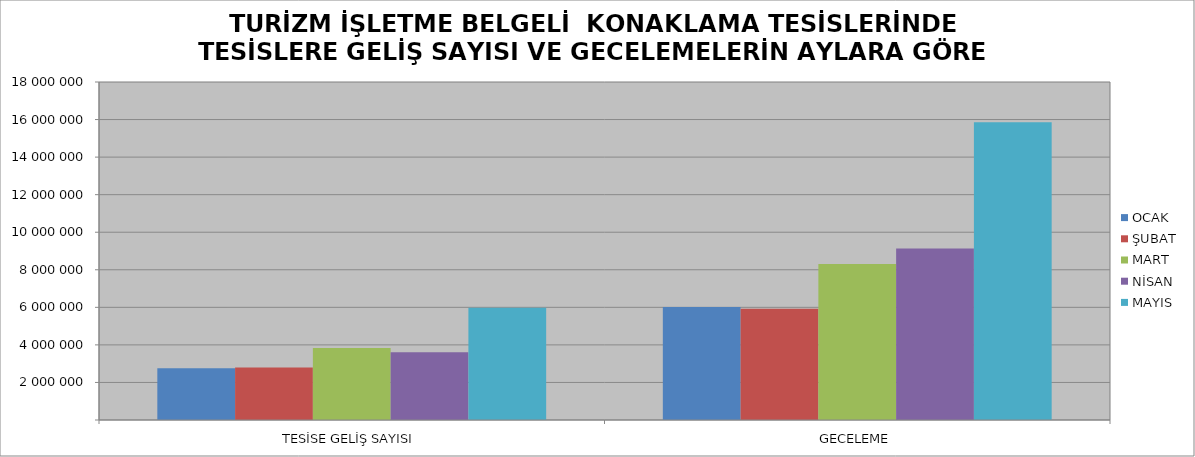
| Category | OCAK | ŞUBAT | MART | NİSAN | MAYIS |
|---|---|---|---|---|---|
| TESİSE GELİŞ SAYISI | 2752012 | 2800059 | 3828458 | 3612924 | 5975439 |
| GECELEME | 6020345 | 5929648 | 8312048 | 9130051 | 15857894 |